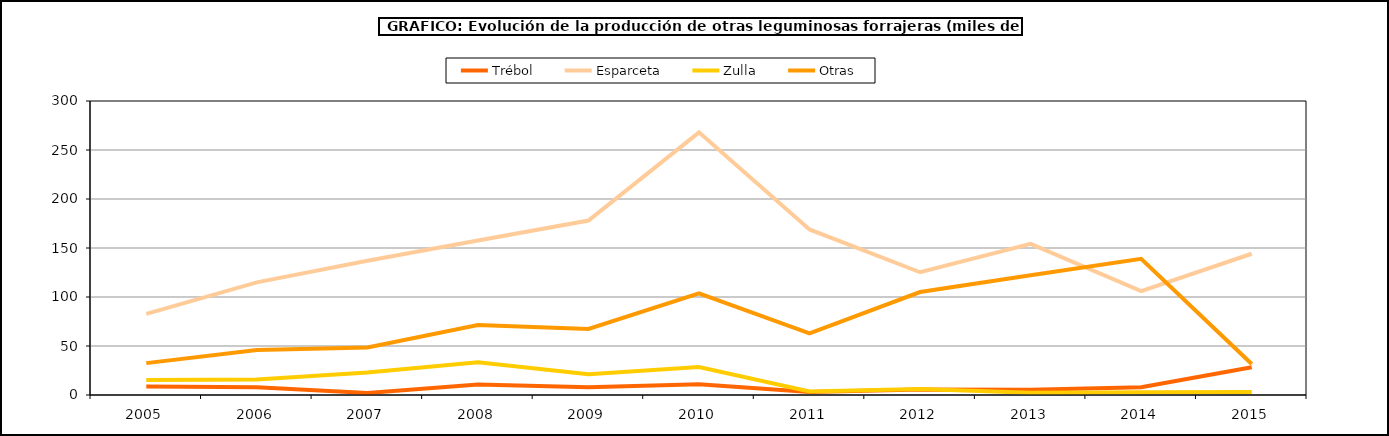
| Category | Trébol | Esparceta | Zulla | Otras |
|---|---|---|---|---|
| 2005.0 | 8.697 | 82.718 | 15.405 | 32.538 |
| 2006.0 | 7.943 | 114.89 | 15.778 | 45.954 |
| 2007.0 | 2.089 | 137.076 | 22.848 | 48.521 |
| 2008.0 | 10.657 | 157.588 | 33.339 | 71.318 |
| 2009.0 | 7.859 | 178.059 | 21.305 | 67.327 |
| 2010.0 | 10.903 | 268.016 | 28.537 | 103.706 |
| 2011.0 | 2.955 | 168.906 | 3.64 | 62.873 |
| 2012.0 | 5.531 | 125.242 | 6.24 | 105.056 |
| 2013.0 | 5.243 | 154.216 | 2.307 | 122.265 |
| 2014.0 | 8 | 105.99 | 2.813 | 139.025 |
| 2015.0 | 28.241 | 144.128 | 3.1 | 31.635 |